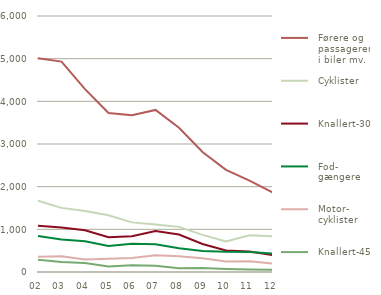
| Category |   Førere og
  passagerer
  i biler mv. |   Cyklister |   Knallert-30 |   Fod-
  gængere |   Motor-
  cyklister |   Knallert-45 |
|---|---|---|---|---|---|---|
| 02 | 5008 | 1671 | 1085 | 846 | 358 | 286 |
| 03 | 4932 | 1503 | 1045 | 760 | 371 | 233 |
| 04 | 4287 | 1429 | 977 | 718 | 293 | 211 |
| 05 | 3726 | 1328 | 813 | 610 | 313 | 129 |
| 06 | 3672 | 1163 | 839 | 661 | 327 | 159 |
| 07 | 3799 | 1115 | 959 | 648 | 393 | 148 |
| 08 | 3381 | 1058 | 878 | 555 | 369 | 88 |
| 09 | 2812 | 871 | 656 | 494 | 324 | 93 |
| 10 | 2395 | 714 | 504 | 473 | 249 | 73 |
| 11 | 2142 | 860 | 478 | 468 | 254 | 57 |
| 12 | 1863 | 839 | 395 | 432 | 198 | 51 |